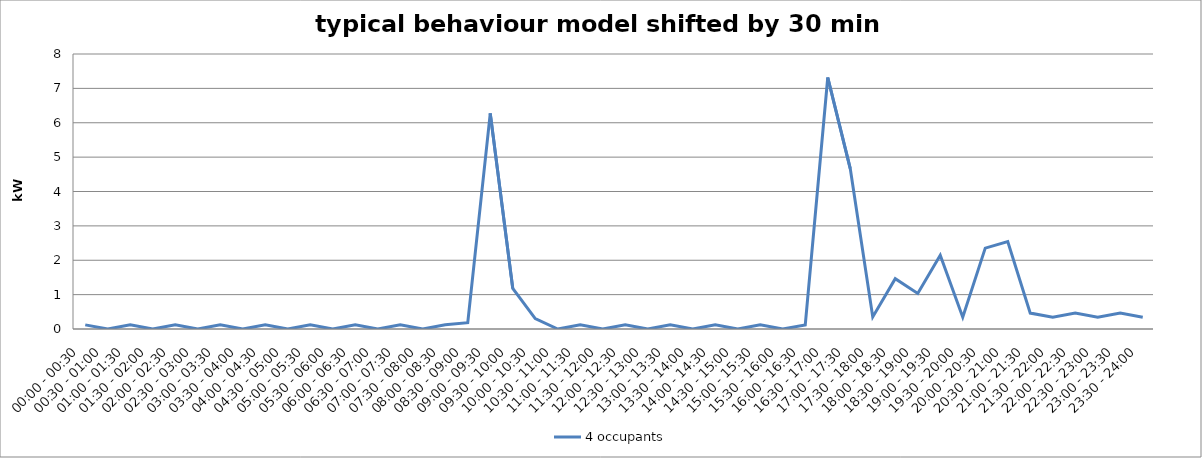
| Category | 4 occupants |
|---|---|
| 00:00 - 00:30 | 0.121 |
| 00:30 - 01:00 | 0 |
| 01:00 - 01:30 | 0.121 |
| 01:30 - 02:00 | 0 |
| 02:00 - 02:30 | 0.121 |
| 02:30 - 03:00 | 0 |
| 03:00 - 03:30 | 0.121 |
| 03:30 - 04:00 | 0 |
| 04:00 - 04:30 | 0.121 |
| 04:30 - 05:00 | 0 |
| 05:00 - 05:30 | 0.121 |
| 05:30 - 06:00 | 0 |
| 06:00 - 06:30 | 0.121 |
| 06:30 - 07:00 | 0 |
| 07:00 - 07:30 | 0.121 |
| 07:30 - 08:00 | 0 |
| 08:00 - 08:30 | 0.121 |
| 08:30 - 09:00 | 0.183 |
| 09:00 - 09:30 | 6.273 |
| 09:30 - 10:00 | 1.182 |
| 10:00 - 10:30 | 0.303 |
| 10:30 - 11:00 | 0 |
| 11:00 - 11:30 | 0.121 |
| 11:30 - 12:00 | 0 |
| 12:00 - 12:30 | 0.121 |
| 12:30 - 13:00 | 0 |
| 13:00 - 13:30 | 0.121 |
| 13:30 - 14:00 | 0 |
| 14:00 - 14:30 | 0.121 |
| 14:30 - 15:00 | 0 |
| 15:00 - 15:30 | 0.121 |
| 15:30 - 16:00 | 0 |
| 16:00 - 16:30 | 0.121 |
| 16:30 - 17:00 | 7.316 |
| 17:00 - 17:30 | 4.667 |
| 17:30 - 18:00 | 0.351 |
| 18:00 - 18:30 | 1.462 |
| 18:30 - 19:00 | 1.033 |
| 19:00 - 19:30 | 2.143 |
| 19:30 - 20:00 | 0.343 |
| 20:00 - 20:30 | 2.353 |
| 20:30 - 21:00 | 2.543 |
| 21:00 - 21:30 | 0.463 |
| 21:30 - 22:00 | 0.343 |
| 22:00 - 22:30 | 0.463 |
| 22:30 - 23:00 | 0.343 |
| 23:00 - 23:30 | 0.463 |
| 23:30 - 24:00 | 0.343 |